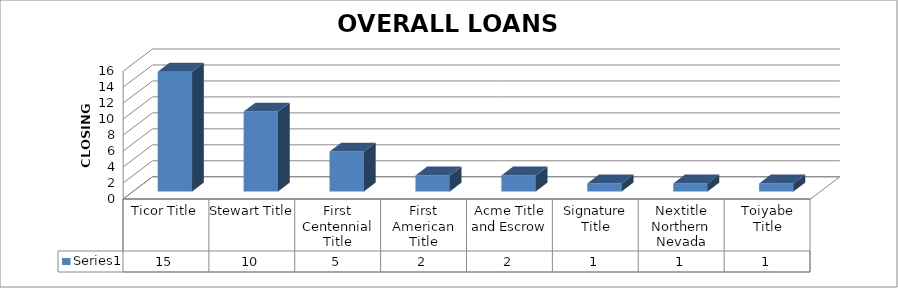
| Category | Series 0 |
|---|---|
| Ticor Title | 15 |
| Stewart Title | 10 |
| First Centennial Title | 5 |
| First American Title | 2 |
| Acme Title and Escrow | 2 |
| Signature Title | 1 |
| Nextitle Northern Nevada | 1 |
| Toiyabe Title | 1 |